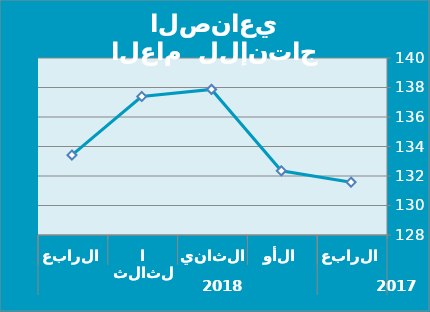
| Category | Series 0 |
|---|---|
| 0 | 131.58 |
| 1 | 132.35 |
| 2 | 137.87 |
| 3 | 137.39 |
| 4 | 133.42 |